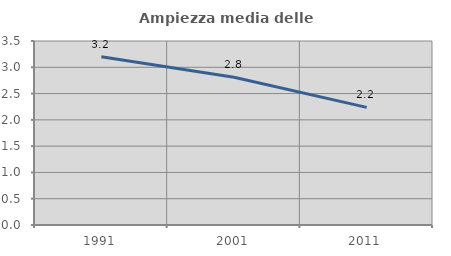
| Category | Ampiezza media delle famiglie |
|---|---|
| 1991.0 | 3.201 |
| 2001.0 | 2.811 |
| 2011.0 | 2.238 |